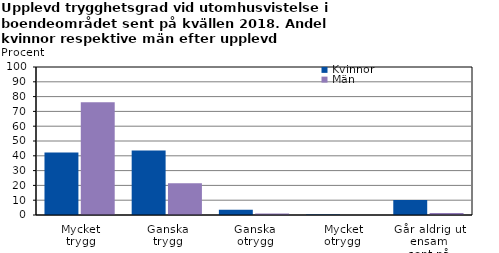
| Category | Kvinnor | Män |
|---|---|---|
| Mycket
trygg | 42.3 | 76.2 |
| Ganska
trygg | 43.6 | 21.4 |
| Ganska
otrygg | 3.6 | 1 |
|  Mycket
otrygg | 0.3 | 0 |
| Går aldrig ut ensam
sent på kvällarna | 10.1 | 1.4 |